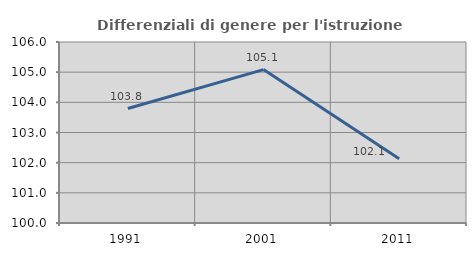
| Category | Differenziali di genere per l'istruzione superiore |
|---|---|
| 1991.0 | 103.794 |
| 2001.0 | 105.086 |
| 2011.0 | 102.13 |